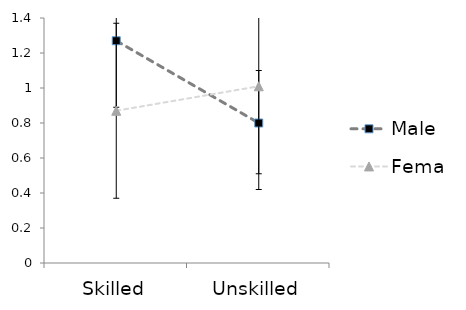
| Category | Male | Female |
|---|---|---|
| Skilled | 1.27 | 0.87 |
| Unskilled | 0.8 | 1.01 |